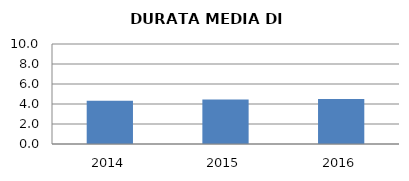
| Category | 2014 2015 2016 |
|---|---|
| 2014.0 | 4.316 |
| 2015.0 | 4.453 |
| 2016.0 | 4.511 |